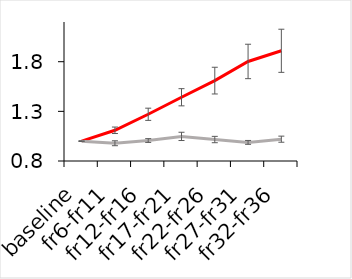
| Category | Series 0 | Series 1 |
|---|---|---|
| baseline | 1 | 1 |
| fr6-fr11 | 1.109 | 0.979 |
| fr12-fr16 | 1.271 | 1.006 |
| fr17-fr21 | 1.442 | 1.048 |
| fr22-fr26 | 1.61 | 1.016 |
| fr27-fr31 | 1.803 | 0.987 |
| fr32-fr36 | 1.91 | 1.02 |